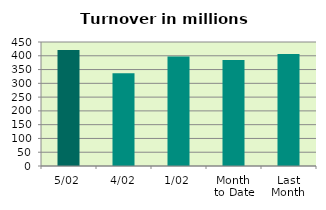
| Category | Series 0 |
|---|---|
| 5/02 | 421.064 |
| 4/02 | 336.366 |
| 1/02 | 397.035 |
| Month 
to Date | 384.822 |
| Last
Month | 406.6 |